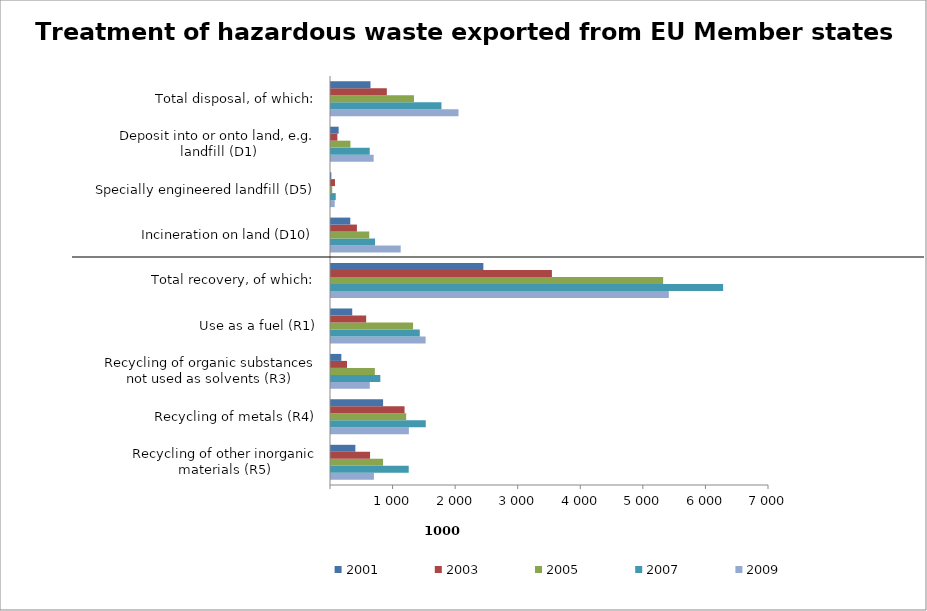
| Category | 2009 | 2007 | 2005 | 2003 | 2001 |
|---|---|---|---|---|---|
| Recycling of other inorganic materials (R5) | 686.351 | 1242.266 | 832.28 | 624.122 | 389.452 |
| Recycling of metals (R4) | 1244.593 | 1514.639 | 1201.248 | 1175.561 | 832.526 |
| Recycling of organic substances not used as solvents (R3) | 619.732 | 788.697 | 700.871 | 255.977 | 165.439 |
| Use as a fuel (R1) | 1512.108 | 1418.874 | 1311.485 | 561.937 | 339.161 |
| Total recovery, of which: | 5398.952 | 6266.793 | 5308.285 | 3530.299 | 2435.27 |
| Incineration on land (D10) | 1113.871 | 703.764 | 611.242 | 413.986 | 308.225 |
| Specially engineered landfill (D5) | 59.441 | 75.616 | 19.531 | 63.805 | 5.458 |
| Deposit into or onto land, e.g. landfill (D1) | 681.838 | 618.895 | 310.359 | 101.658 | 121.958 |
| Total disposal, of which: | 2037.729 | 1765.064 | 1326.071 | 892.523 | 630.938 |